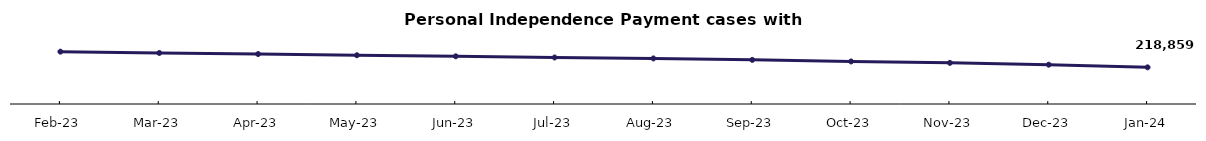
| Category | Series 0 |
|---|---|
| Feb-23 | 312473 |
| Mar-23 | 304704 |
| Apr-23 | 298259 |
| May-23 | 291060 |
| Jun-23 | 284671 |
| Jul-23 | 277716 |
| Aug-23 | 271999 |
| Sep-23 | 263472 |
| Oct-23 | 253943 |
| Nov-23 | 245528 |
| Dec-23 | 234731 |
| Jan-24 | 218859 |